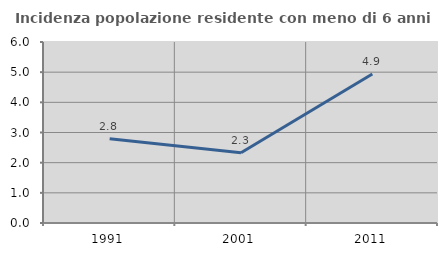
| Category | Incidenza popolazione residente con meno di 6 anni |
|---|---|
| 1991.0 | 2.79 |
| 2001.0 | 2.329 |
| 2011.0 | 4.937 |